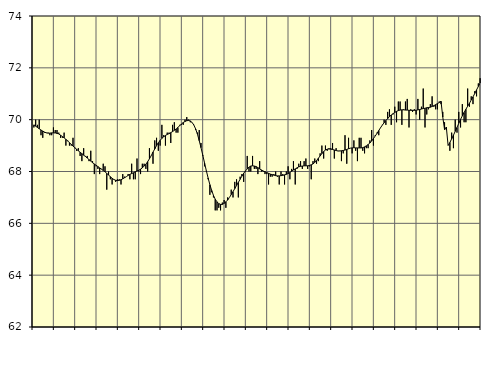
| Category | Piggar | Series 1 |
|---|---|---|
| nan | 69.7 | 69.8 |
| 1.0 | 70 | 69.75 |
| 1.0 | 69.8 | 69.7 |
| 1.0 | 70 | 69.65 |
| 1.0 | 69.4 | 69.6 |
| 1.0 | 69.3 | 69.56 |
| 1.0 | 69.5 | 69.52 |
| 1.0 | 69.5 | 69.49 |
| 1.0 | 69.5 | 69.48 |
| 1.0 | 69.4 | 69.48 |
| 1.0 | 69.4 | 69.49 |
| 1.0 | 69.7 | 69.49 |
| nan | 69.6 | 69.49 |
| 2.0 | 69.6 | 69.47 |
| 2.0 | 69.5 | 69.45 |
| 2.0 | 69.3 | 69.4 |
| 2.0 | 69.3 | 69.35 |
| 2.0 | 69.5 | 69.3 |
| 2.0 | 69 | 69.24 |
| 2.0 | 69.2 | 69.18 |
| 2.0 | 69 | 69.11 |
| 2.0 | 69 | 69.05 |
| 2.0 | 69.3 | 68.98 |
| 2.0 | 68.9 | 68.92 |
| nan | 68.8 | 68.86 |
| 3.0 | 68.9 | 68.8 |
| 3.0 | 68.6 | 68.74 |
| 3.0 | 68.4 | 68.69 |
| 3.0 | 68.9 | 68.63 |
| 3.0 | 68.6 | 68.58 |
| 3.0 | 68.6 | 68.52 |
| 3.0 | 68.4 | 68.46 |
| 3.0 | 68.8 | 68.4 |
| 3.0 | 68.4 | 68.34 |
| 3.0 | 67.9 | 68.29 |
| 3.0 | 68.2 | 68.24 |
| nan | 68.1 | 68.19 |
| 4.0 | 67.9 | 68.14 |
| 4.0 | 68.1 | 68.09 |
| 4.0 | 68.3 | 68.04 |
| 4.0 | 68.2 | 67.99 |
| 4.0 | 67.3 | 67.93 |
| 4.0 | 68 | 67.86 |
| 4.0 | 67.7 | 67.8 |
| 4.0 | 67.5 | 67.74 |
| 4.0 | 67.7 | 67.69 |
| 4.0 | 67.6 | 67.66 |
| 4.0 | 67.7 | 67.65 |
| nan | 67.7 | 67.66 |
| 5.0 | 67.5 | 67.68 |
| 5.0 | 67.9 | 67.72 |
| 5.0 | 67.8 | 67.76 |
| 5.0 | 67.8 | 67.8 |
| 5.0 | 67.9 | 67.85 |
| 5.0 | 67.7 | 67.89 |
| 5.0 | 68.3 | 67.92 |
| 5.0 | 67.7 | 67.95 |
| 5.0 | 67.7 | 67.99 |
| 5.0 | 68.5 | 68.02 |
| 5.0 | 68 | 68.05 |
| nan | 67.9 | 68.09 |
| 6.0 | 68.3 | 68.14 |
| 6.0 | 68.3 | 68.21 |
| 6.0 | 68.1 | 68.28 |
| 6.0 | 68 | 68.38 |
| 6.0 | 68.9 | 68.49 |
| 6.0 | 68.6 | 68.61 |
| 6.0 | 68.3 | 68.75 |
| 6.0 | 69.2 | 68.87 |
| 6.0 | 69.3 | 69 |
| 6.0 | 68.8 | 69.11 |
| 6.0 | 69 | 69.2 |
| nan | 69.8 | 69.28 |
| 7.0 | 69.4 | 69.34 |
| 7.0 | 69 | 69.39 |
| 7.0 | 69.5 | 69.43 |
| 7.0 | 69.5 | 69.46 |
| 7.0 | 69.1 | 69.5 |
| 7.0 | 69.8 | 69.54 |
| 7.0 | 69.9 | 69.59 |
| 7.0 | 69.5 | 69.64 |
| 7.0 | 69.5 | 69.7 |
| 7.0 | 69.8 | 69.77 |
| 7.0 | 69.8 | 69.83 |
| nan | 69.8 | 69.89 |
| 8.0 | 70 | 69.93 |
| 8.0 | 70.1 | 69.96 |
| 8.0 | 70 | 69.97 |
| 8.0 | 69.9 | 69.95 |
| 8.0 | 69.9 | 69.89 |
| 8.0 | 69.8 | 69.79 |
| 8.0 | 69.6 | 69.64 |
| 8.0 | 69.5 | 69.44 |
| 8.0 | 69.6 | 69.19 |
| 8.0 | 69.1 | 68.92 |
| 8.0 | 68.6 | 68.63 |
| nan | 68.2 | 68.33 |
| 9.0 | 68 | 68.03 |
| 9.0 | 67.7 | 67.75 |
| 9.0 | 67.1 | 67.49 |
| 9.0 | 67.2 | 67.27 |
| 9.0 | 67 | 67.08 |
| 9.0 | 66.5 | 66.93 |
| 9.0 | 66.5 | 66.83 |
| 9.0 | 66.6 | 66.76 |
| 9.0 | 66.5 | 66.73 |
| 9.0 | 66.8 | 66.73 |
| 9.0 | 66.9 | 66.77 |
| nan | 66.6 | 66.83 |
| 10.0 | 67 | 66.9 |
| 10.0 | 67 | 67 |
| 10.0 | 67.3 | 67.11 |
| 10.0 | 67 | 67.22 |
| 10.0 | 67.6 | 67.34 |
| 10.0 | 67.7 | 67.46 |
| 10.0 | 67 | 67.58 |
| 10.0 | 67.8 | 67.7 |
| 10.0 | 67.9 | 67.82 |
| 10.0 | 67.6 | 67.93 |
| 10.0 | 68 | 68.02 |
| nan | 68.6 | 68.1 |
| 11.0 | 68 | 68.17 |
| 11.0 | 68 | 68.21 |
| 11.0 | 68.6 | 68.22 |
| 11.0 | 68.1 | 68.21 |
| 11.0 | 68.1 | 68.19 |
| 11.0 | 67.9 | 68.15 |
| 11.0 | 68.4 | 68.1 |
| 11.0 | 68 | 68.06 |
| 11.0 | 68 | 68.02 |
| 11.0 | 67.9 | 67.99 |
| 11.0 | 67.9 | 67.96 |
| nan | 67.5 | 67.93 |
| 12.0 | 67.8 | 67.9 |
| 12.0 | 67.8 | 67.88 |
| 12.0 | 67.9 | 67.86 |
| 12.0 | 68 | 67.84 |
| 12.0 | 67.8 | 67.83 |
| 12.0 | 67.5 | 67.83 |
| 12.0 | 68 | 67.84 |
| 12.0 | 67.9 | 67.85 |
| 12.0 | 67.5 | 67.87 |
| 12.0 | 68 | 67.89 |
| 12.0 | 68.2 | 67.92 |
| nan | 67.7 | 67.96 |
| 13.0 | 68.1 | 68.01 |
| 13.0 | 68.4 | 68.06 |
| 13.0 | 67.5 | 68.1 |
| 13.0 | 68.1 | 68.14 |
| 13.0 | 68.3 | 68.18 |
| 13.0 | 68.4 | 68.2 |
| 13.0 | 68.1 | 68.21 |
| 13.0 | 68.4 | 68.22 |
| 13.0 | 68.5 | 68.22 |
| 13.0 | 68.1 | 68.22 |
| 13.0 | 68.2 | 68.23 |
| nan | 67.7 | 68.26 |
| 14.0 | 68.4 | 68.29 |
| 14.0 | 68.5 | 68.35 |
| 14.0 | 68.3 | 68.42 |
| 14.0 | 68.4 | 68.51 |
| 14.0 | 68.7 | 68.6 |
| 14.0 | 69 | 68.69 |
| 14.0 | 68.5 | 68.77 |
| 14.0 | 69 | 68.83 |
| 14.0 | 68.8 | 68.86 |
| 14.0 | 68.9 | 68.87 |
| 14.0 | 68.9 | 68.86 |
| nan | 69.1 | 68.85 |
| 15.0 | 68.5 | 68.83 |
| 15.0 | 68.9 | 68.81 |
| 15.0 | 68.8 | 68.79 |
| 15.0 | 68.8 | 68.79 |
| 15.0 | 68.4 | 68.8 |
| 15.0 | 68.7 | 68.81 |
| 15.0 | 69.4 | 68.83 |
| 15.0 | 68.3 | 68.85 |
| 15.0 | 69.3 | 68.88 |
| 15.0 | 68.9 | 68.9 |
| 15.0 | 68.7 | 68.91 |
| nan | 69.2 | 68.92 |
| 16.0 | 68.8 | 68.91 |
| 16.0 | 68.4 | 68.91 |
| 16.0 | 69.3 | 68.91 |
| 16.0 | 69.3 | 68.91 |
| 16.0 | 68.8 | 68.92 |
| 16.0 | 68.7 | 68.95 |
| 16.0 | 68.9 | 68.99 |
| 16.0 | 68.9 | 69.04 |
| 16.0 | 69.2 | 69.1 |
| 16.0 | 69.6 | 69.18 |
| 16.0 | 69 | 69.27 |
| nan | 69.4 | 69.37 |
| 17.0 | 69.5 | 69.47 |
| 17.0 | 69.4 | 69.58 |
| 17.0 | 69.7 | 69.69 |
| 17.0 | 69.8 | 69.79 |
| 17.0 | 70 | 69.88 |
| 17.0 | 69.8 | 69.97 |
| 17.0 | 70.3 | 70.04 |
| 17.0 | 70.4 | 70.12 |
| 17.0 | 69.8 | 70.18 |
| 17.0 | 70.2 | 70.23 |
| 17.0 | 70.5 | 70.28 |
| nan | 69.9 | 70.32 |
| 18.0 | 70.7 | 70.35 |
| 18.0 | 70.7 | 70.37 |
| 18.0 | 69.8 | 70.38 |
| 18.0 | 70.4 | 70.38 |
| 18.0 | 70.7 | 70.37 |
| 18.0 | 70.8 | 70.37 |
| 18.0 | 69.7 | 70.36 |
| 18.0 | 70.4 | 70.36 |
| 18.0 | 70.3 | 70.36 |
| 18.0 | 70.4 | 70.36 |
| 18.0 | 70.2 | 70.36 |
| nan | 70.8 | 70.38 |
| 19.0 | 70 | 70.39 |
| 19.0 | 70.5 | 70.41 |
| 19.0 | 71.2 | 70.43 |
| 19.0 | 69.7 | 70.44 |
| 19.0 | 70.2 | 70.46 |
| 19.0 | 70.4 | 70.47 |
| 19.0 | 70.6 | 70.48 |
| 19.0 | 70.9 | 70.51 |
| 19.0 | 70.5 | 70.54 |
| 19.0 | 70.4 | 70.58 |
| 19.0 | 70.4 | 70.62 |
| nan | 70.7 | 70.66 |
| 20.0 | 70.6 | 70.71 |
| 20.0 | 70.3 | 70.1 |
| 20.0 | 69.9 | 69.62 |
| 20.0 | 69.6 | 69.71 |
| 20.0 | 69 | 69 |
| 20.0 | 68.8 | 69.12 |
| 20.0 | 69.5 | 69.26 |
| 20.0 | 68.9 | 69.4 |
| 20.0 | 70 | 69.55 |
| 20.0 | 69.5 | 69.7 |
| 20.0 | 70.3 | 69.86 |
| nan | 69.7 | 70.01 |
| 21.0 | 70.6 | 70.15 |
| 21.0 | 69.9 | 70.28 |
| 21.0 | 69.9 | 70.4 |
| 21.0 | 71.2 | 70.52 |
| 21.0 | 70.5 | 70.63 |
| 21.0 | 70.9 | 70.76 |
| 21.0 | 70.6 | 70.88 |
| 21.0 | 71.1 | 71.01 |
| 21.0 | 70.9 | 71.15 |
| 21.0 | 71.4 | 71.28 |
| 21.0 | 71.6 | 71.41 |